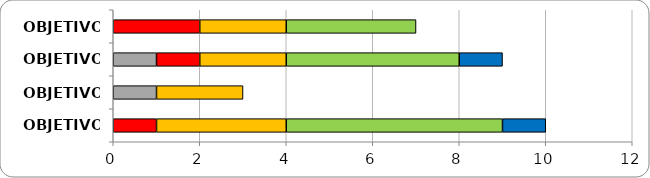
| Category | Series 0 | Series 1 | Series 2 | Series 3 | Series 4 | Series 5 |
|---|---|---|---|---|---|---|
| OBJETIVO 1 | 0 | 0 | 2 | 2 | 3 | 0 |
| OBJETIVO 2 | 0 | 1 | 1 | 2 | 4 | 1 |
| OBJETIVO 3 | 0 | 1 | 0 | 2 | 0 | 0 |
| OBJETIVO 4 | 0 | 0 | 1 | 3 | 5 | 1 |